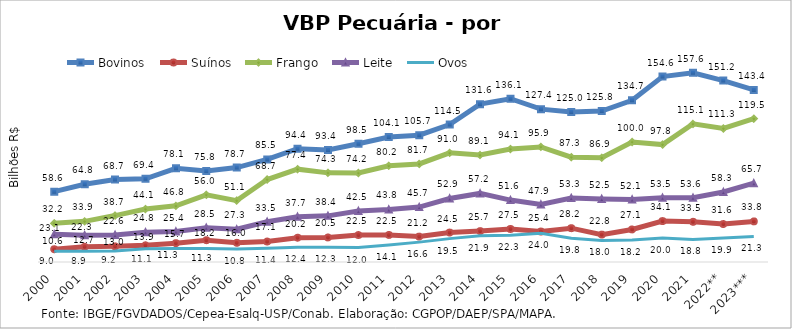
| Category | Bovinos | Suínos | Frango | Leite | Ovos |
|---|---|---|---|---|---|
| 2000 | 58.596 | 10.61 | 32.243 | 23.145 | 9.05 |
| 2001 | 64.773 | 12.729 | 33.89 | 22.272 | 8.918 |
| 2002 | 68.736 | 13.046 | 38.684 | 22.552 | 9.188 |
| 2003 | 69.373 | 13.943 | 44.103 | 24.835 | 11.113 |
| 2004 | 78.052 | 15.676 | 46.831 | 25.382 | 11.264 |
| 2005 | 75.778 | 18.175 | 55.99 | 28.548 | 11.34 |
| 2006 | 78.676 | 15.987 | 51.149 | 27.268 | 10.772 |
| 2007 | 85.503 | 17.096 | 68.724 | 33.522 | 11.448 |
| 2008 | 94.405 | 20.243 | 77.361 | 37.71 | 12.364 |
| 2009 | 93.42 | 20.462 | 74.278 | 38.446 | 12.328 |
| 2010 | 98.493 | 22.511 | 74.188 | 42.458 | 11.99 |
| 2011 | 104.122 | 22.546 | 80.238 | 43.77 | 14.129 |
| 2012 | 105.674 | 21.17 | 81.735 | 45.738 | 16.562 |
| 2013 | 114.514 | 24.511 | 90.972 | 52.927 | 19.479 |
| 2014 | 131.555 | 25.745 | 89.133 | 57.155 | 21.886 |
| 2015 | 136.083 | 27.513 | 94.096 | 51.592 | 22.284 |
| 2016 | 127.38 | 25.39 | 95.878 | 47.871 | 24.024 |
| 2017 | 125.002 | 28.186 | 87.328 | 53.338 | 19.802 |
| 2018 | 125.839 | 22.827 | 86.852 | 52.546 | 18.007 |
| 2019 | 134.746 | 27.132 | 100.001 | 52.059 | 18.236 |
| 2020 | 154.562 | 34.105 | 97.838 | 53.524 | 20.027 |
| 2021 | 157.613 | 33.497 | 115.096 | 53.583 | 18.767 |
| 2022** | 151.189 | 31.646 | 111.276 | 58.312 | 19.931 |
| 2023*** | 143.404 | 33.832 | 119.453 | 65.668 | 21.3 |